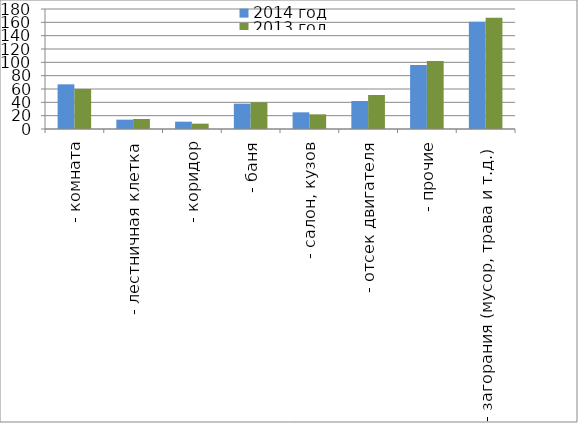
| Category | 2014 год | 2013 год |
|---|---|---|
|  - комната | 67 | 60 |
|  - лестничная клетка | 14 | 15 |
|  - коридор | 11 | 8 |
|  - баня | 38 | 40 |
|  - салон, кузов | 25 | 22 |
|  - отсек двигателя | 42 | 51 |
| - прочие | 96 | 102 |
| - загорания (мусор, трава и т.д.)  | 161 | 167 |